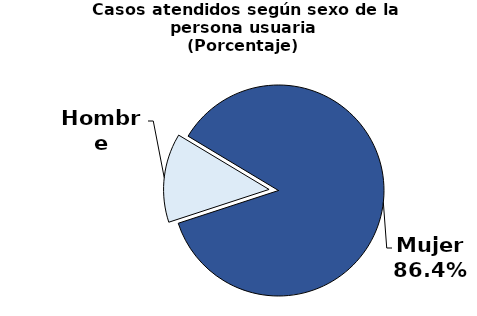
| Category | Series 0 |
|---|---|
| Mujer | 15924 |
| Hombre | 2515 |